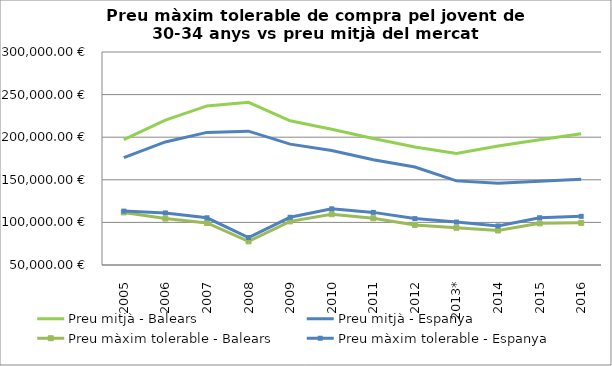
| Category | Preu mitjà - Balears | Preu mitjà - Espanya | Preu màxim tolerable - Balears | Preu màxim tolerable - Espanya |
|---|---|---|---|---|
| 2005 | 197225 | 176100 | 111716.64 | 113239.62 |
| 2006 | 219972.5 | 194427.5 | 104480.16 | 111124.38 |
| 2007 | 236745 | 205635 | 99341.14 | 105430.9 |
| 2008 | 240952.5 | 207107.5 | 77783.24 | 82268.19 |
| 2009 | 219235 | 191852.5 | 101190.78 | 106000.32 |
| 2010 | 209335 | 184302.5 | 109608.23 | 115945.98 |
| 2011 | 198513.333 | 173623.333 | 104895.44 | 111751.74 |
| 2012 | 188570 | 164930 | 97022.84 | 104454.55 |
| 2013* | 180985 | 148732.5 | 93755.832 | 100392.988 |
| 2014 | 189585 | 145940 | 90517.647 | 95853.695 |
| 2015 | 197120 | 148345 | 98908.345 | 105494.09 |
| 2016 | 204170 | 150640 | 99514.55 | 107118.08 |